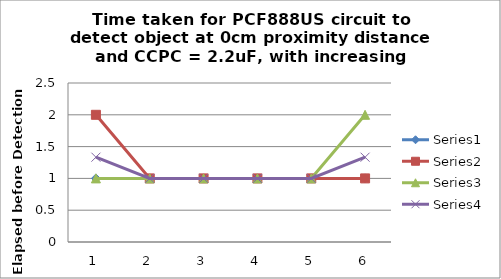
| Category | Series 0 | Series 1 | Series 2 | Series 3 |
|---|---|---|---|---|
| 0 | 1 | 2 | 1 | 1.333 |
| 1 | 1 | 1 | 1 | 1 |
| 2 | 1 | 1 | 1 | 1 |
| 3 | 1 | 1 | 1 | 1 |
| 4 | 1 | 1 | 1 | 1 |
| 5 | 1 | 1 | 2 | 1.333 |